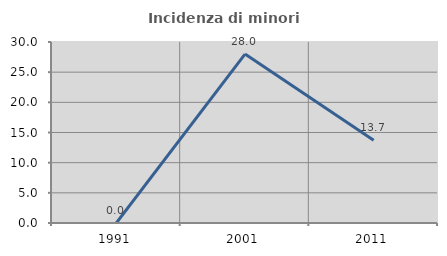
| Category | Incidenza di minori stranieri |
|---|---|
| 1991.0 | 0 |
| 2001.0 | 28 |
| 2011.0 | 13.699 |